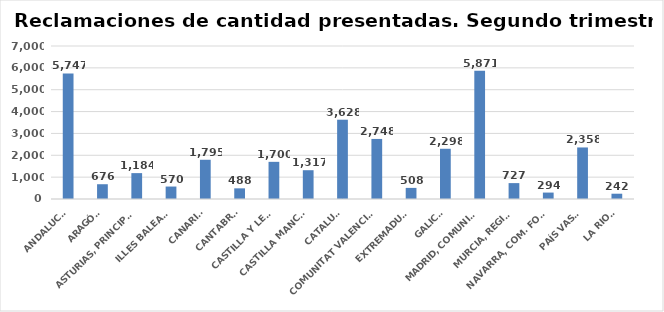
| Category | Series 0 |
|---|---|
| ANDALUCÍA | 5747 |
| ARAGÓN | 676 |
| ASTURIAS, PRINCIPADO | 1184 |
| ILLES BALEARS | 570 |
| CANARIAS | 1795 |
| CANTABRIA | 488 |
| CASTILLA Y LEÓN | 1700 |
| CASTILLA MANCHA | 1317 |
| CATALUÑA | 3628 |
| COMUNITAT VALENCIANA | 2748 |
| EXTREMADURA | 508 |
| GALICIA | 2298 |
| MADRID, COMUNIDAD | 5871 |
| MURCIA, REGIÓN | 727 |
| NAVARRA, COM. FORAL | 294 |
| PAÍS VASCO | 2358 |
| LA RIOJA | 242 |